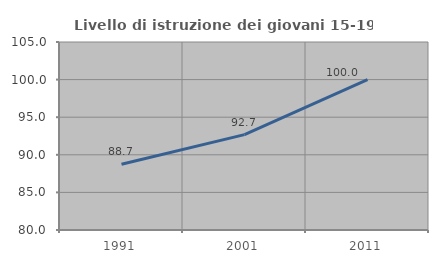
| Category | Livello di istruzione dei giovani 15-19 anni |
|---|---|
| 1991.0 | 88.732 |
| 2001.0 | 92.683 |
| 2011.0 | 100 |